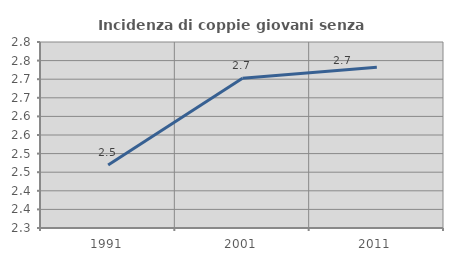
| Category | Incidenza di coppie giovani senza figli |
|---|---|
| 1991.0 | 2.469 |
| 2001.0 | 2.703 |
| 2011.0 | 2.732 |